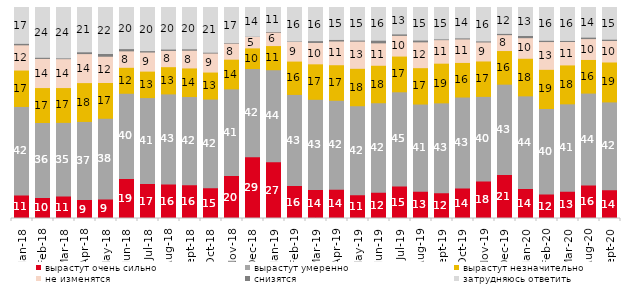
| Category | вырастут очень сильно | вырастут умеренно | вырастут незначительно | не изменятся | снизятся | затрудняюсь ответить |
|---|---|---|---|---|---|---|
| 2018-01-01 | 11.1 | 42 | 17.25 | 11.95 | 0.7 | 17 |
| 2018-02-01 | 10 | 35.5 | 16.55 | 13.8 | 0.55 | 23.6 |
| 2018-03-01 | 10.65 | 34.9 | 16.5 | 13.7 | 0.35 | 23.9 |
| 2018-04-01 | 8.95 | 37.05 | 18.4 | 13.75 | 0.85 | 21 |
| 2018-05-01 | 9.3 | 38.2 | 16.95 | 12.45 | 1.3 | 21.8 |
| 2018-06-01 | 18.95 | 40.4 | 12.3 | 7.8 | 1.05 | 19.5 |
| 2018-07-01 | 16.55 | 40.75 | 12.55 | 9.05 | 0.65 | 20.45 |
| 2018-08-01 | 16.35 | 42.7 | 12.9 | 7.7 | 0.65 | 19.7 |
| 2018-09-01 | 16.05 | 41.75 | 13.55 | 8.4 | 0.65 | 19.6 |
| 2018-10-01 | 14.6 | 42 | 12.8 | 9 | 0.4 | 21.2 |
| 2018-11-01 | 20.359 | 41.068 | 14.072 | 7.585 | 0.25 | 16.667 |
| 2018-12-01 | 29.25 | 41.8 | 9.8 | 5.4 | 0.1 | 13.65 |
| 2019-01-01 | 26.85 | 43.65 | 11.45 | 6.35 | 0.3 | 11.4 |
| 2019-02-01 | 15.6 | 43.2 | 15.8 | 9.35 | 0.15 | 15.9 |
| 2019-03-01 | 13.774 | 42.715 | 16.808 | 10.144 | 0.845 | 15.714 |
| 2019-04-01 | 13.911 | 42.129 | 16.832 | 11.238 | 0.743 | 15.149 |
| 2019-05-01 | 11.293 | 42.15 | 17.732 | 12.878 | 0.495 | 15.453 |
| 2019-06-01 | 12.419 | 42.444 | 17.756 | 10.623 | 1.247 | 15.511 |
| 2019-07-01 | 15.396 | 44.653 | 16.931 | 9.802 | 0.693 | 12.525 |
| 2019-08-01 | 12.887 | 41.359 | 17.233 | 12.238 | 0.849 | 15.435 |
| 2019-09-01 | 12.228 | 42.574 | 18.812 | 11.139 | 0.347 | 14.901 |
| 2019-10-01 | 14.455 | 43.119 | 16.386 | 11.139 | 0.495 | 14.406 |
| 2019-11-01 | 17.772 | 40.099 | 16.782 | 9.01 | 0.495 | 15.842 |
| 2019-12-01 | 20.891 | 42.772 | 15.941 | 7.525 | 0.594 | 12.277 |
| 2020-01-01 | 14.208 | 43.911 | 17.822 | 9.752 | 1.04 | 13.267 |
| 2020-02-01 | 11.634 | 40.495 | 18.564 | 13.168 | 0.594 | 15.545 |
| 2020-03-01 | 12.94 | 41.398 | 18.443 | 11.106 | 0.496 | 15.617 |
| 2020-08-01 | 15.839 | 43.595 | 15.938 | 9.881 | 0.695 | 14.052 |
| 2020-09-01 | 13.639 | 41.613 | 18.915 | 10.204 | 0.597 | 15.032 |